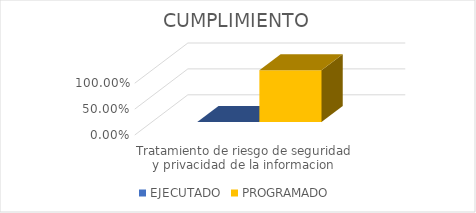
| Category | EJECUTADO | PROGRAMADO |
|---|---|---|
| Tratamiento de riesgo de seguridad y privacidad de la informacion | 0 | 1 |